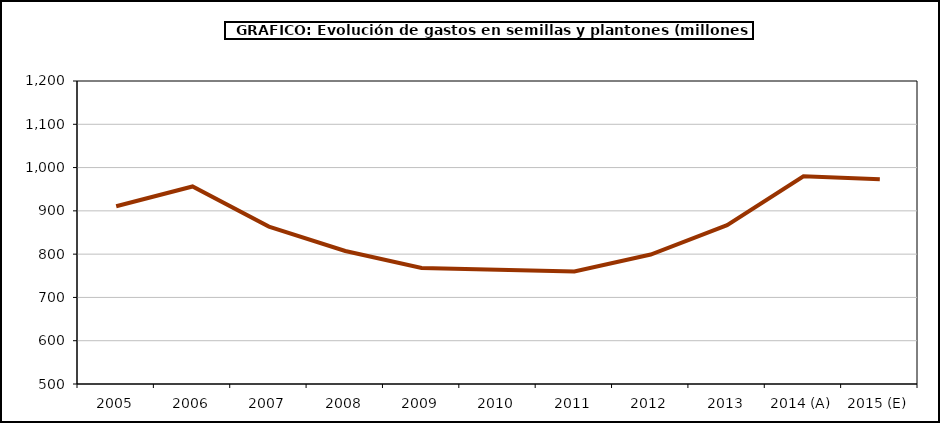
| Category | Semillas |
|---|---|
| 2005 | 910.611 |
| 2006 | 956.313 |
| 2007 | 863.62 |
| 2008 | 807.244 |
| 2009 | 768.186 |
| 2010 | 763.963 |
| 2011 | 759.736 |
| 2012 | 799.053 |
| 2013 | 867.097 |
| 2014 (A) | 980.019 |
| 2015 (E) | 972.994 |